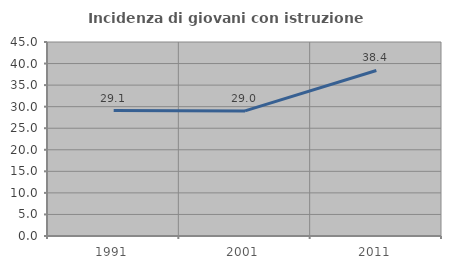
| Category | Incidenza di giovani con istruzione universitaria |
|---|---|
| 1991.0 | 29.102 |
| 2001.0 | 29.019 |
| 2011.0 | 38.391 |